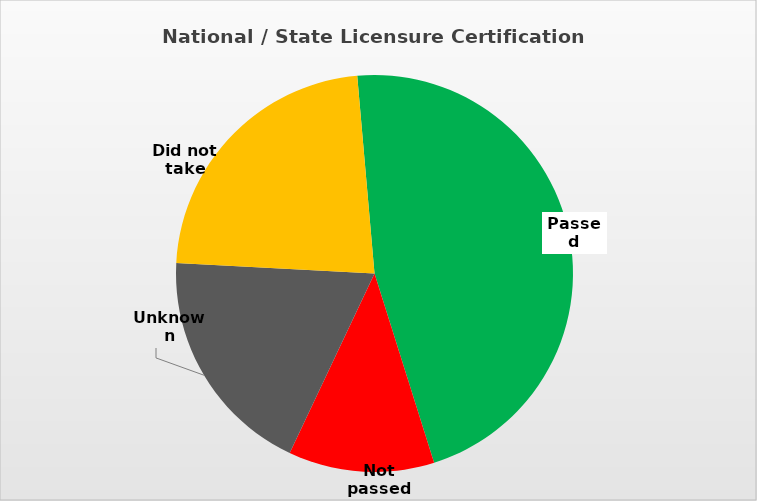
| Category | Series 0 |
|---|---|
| Passed | 0.465 |
| Not passed | 0.119 |
| Unknown | 0.188 |
| Did not take | 0.228 |